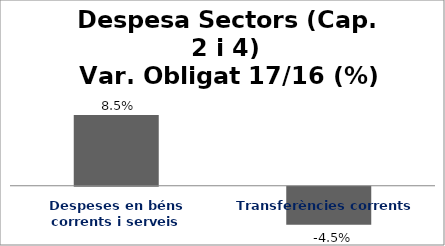
| Category | Series 0 |
|---|---|
| Despeses en béns corrents i serveis | 0.085 |
| Transferències corrents | -0.045 |